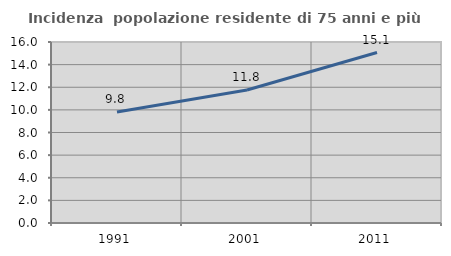
| Category | Incidenza  popolazione residente di 75 anni e più |
|---|---|
| 1991.0 | 9.819 |
| 2001.0 | 11.756 |
| 2011.0 | 15.067 |